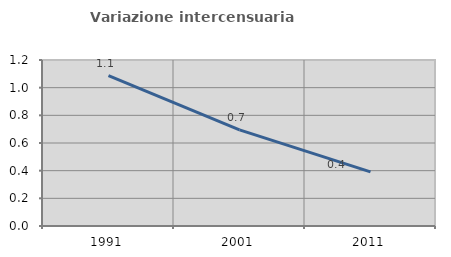
| Category | Variazione intercensuaria annua |
|---|---|
| 1991.0 | 1.087 |
| 2001.0 | 0.695 |
| 2011.0 | 0.391 |